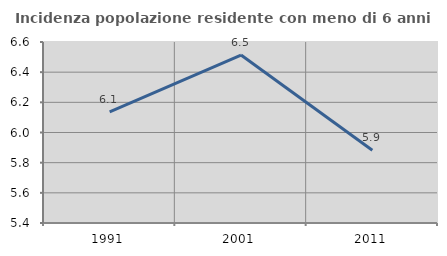
| Category | Incidenza popolazione residente con meno di 6 anni |
|---|---|
| 1991.0 | 6.137 |
| 2001.0 | 6.513 |
| 2011.0 | 5.882 |